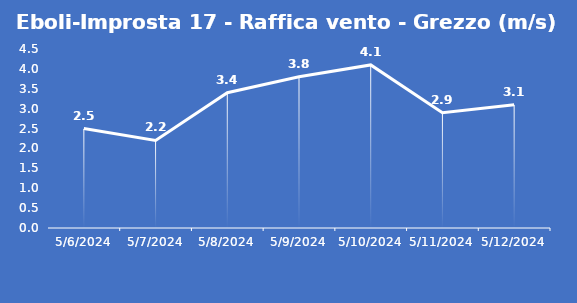
| Category | Eboli-Improsta 17 - Raffica vento - Grezzo (m/s) |
|---|---|
| 5/6/24 | 2.5 |
| 5/7/24 | 2.2 |
| 5/8/24 | 3.4 |
| 5/9/24 | 3.8 |
| 5/10/24 | 4.1 |
| 5/11/24 | 2.9 |
| 5/12/24 | 3.1 |